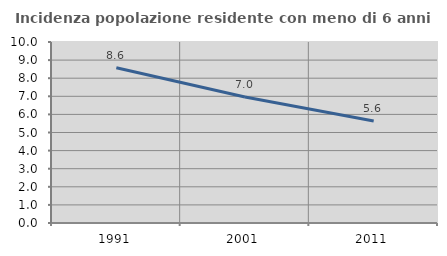
| Category | Incidenza popolazione residente con meno di 6 anni |
|---|---|
| 1991.0 | 8.578 |
| 2001.0 | 6.958 |
| 2011.0 | 5.631 |